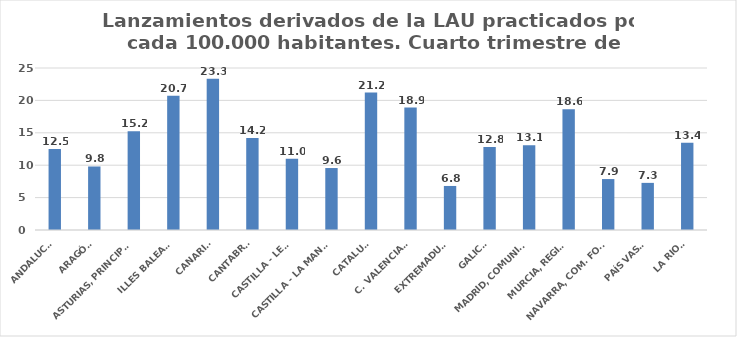
| Category | Series 0 |
|---|---|
| ANDALUCÍA | 12.508 |
| ARAGÓN | 9.802 |
| ASTURIAS, PRINCIPADO | 15.221 |
| ILLES BALEARS | 20.716 |
| CANARIAS | 23.332 |
| CANTABRIA | 14.2 |
| CASTILLA - LEÓN | 10.994 |
| CASTILLA - LA MANCHA | 9.563 |
| CATALUÑA | 21.202 |
| C. VALENCIANA | 18.9 |
| EXTREMADURA | 6.796 |
| GALICIA | 12.798 |
| MADRID, COMUNIDAD | 13.079 |
| MURCIA, REGIÓN | 18.637 |
| NAVARRA, COM. FORAL | 7.86 |
| PAÍS VASCO | 7.272 |
| LA RIOJA | 13.446 |